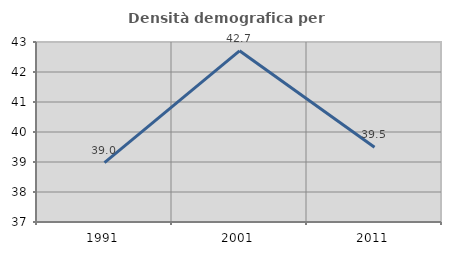
| Category | Densità demografica |
|---|---|
| 1991.0 | 38.982 |
| 2001.0 | 42.707 |
| 2011.0 | 39.49 |